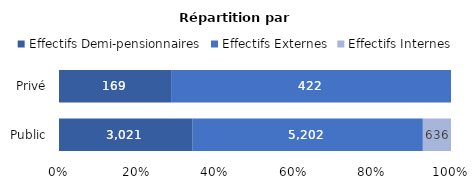
| Category | Effectifs Demi-pensionnaires | Effectifs Externes | Effectifs Internes |
|---|---|---|---|
| Public | 3021 | 5202 | 636 |
| Privé | 169 | 422 | 0 |